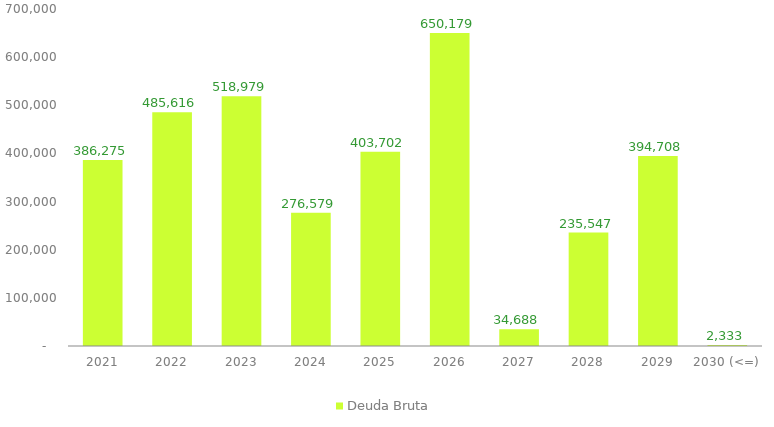
| Category | Deuda Bruta |
|---|---|
| 2021 | 386274.716 |
| 2022 | 485616.395 |
| 2023 | 518979.094 |
| 2024 | 276578.622 |
| 2025 | 403701.99 |
| 2026 | 650178.568 |
| 2027 | 34687.87 |
| 2028 | 235547.198 |
| 2029 | 394708.463 |
| 2030 (<=) | 2332.913 |